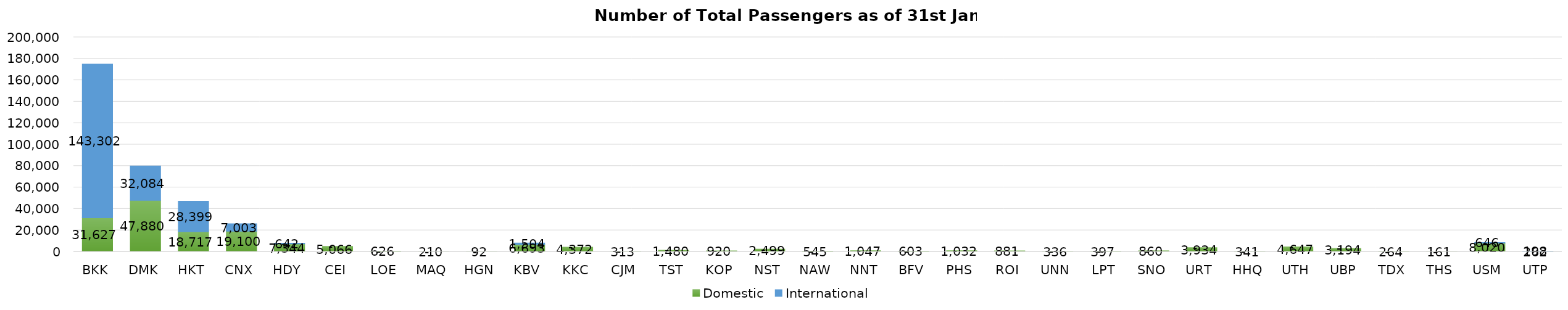
| Category | Domestic | International |
|---|---|---|
| BKK | 31627 | 143302 |
| DMK | 47880 | 32084 |
| HKT | 18717 | 28399 |
| CNX | 19100 | 7003 |
| HDY | 7344 | 642 |
| CEI | 5066 | 0 |
| LOE | 626 | 0 |
| MAQ | 210 | 0 |
| HGN | 92 | 0 |
| KBV | 6693 | 1504 |
| KKC | 4372 | 0 |
| CJM | 313 | 0 |
| TST | 1480 | 0 |
| KOP | 920 | 0 |
| NST | 2499 | 0 |
| NAW | 545 | 0 |
| NNT | 1047 | 0 |
| BFV | 603 | 0 |
| PHS | 1032 | 0 |
| ROI | 881 | 0 |
| UNN | 336 | 0 |
| LPT | 397 | 0 |
| SNO | 860 | 0 |
| URT | 3934 | 0 |
| HHQ | 341 | 0 |
| UTH | 4647 | 0 |
| UBP | 3194 | 0 |
| TDX | 264 | 0 |
| THS | 161 | 0 |
| USM | 8020 | 646 |
| UTP | 262 | 198 |